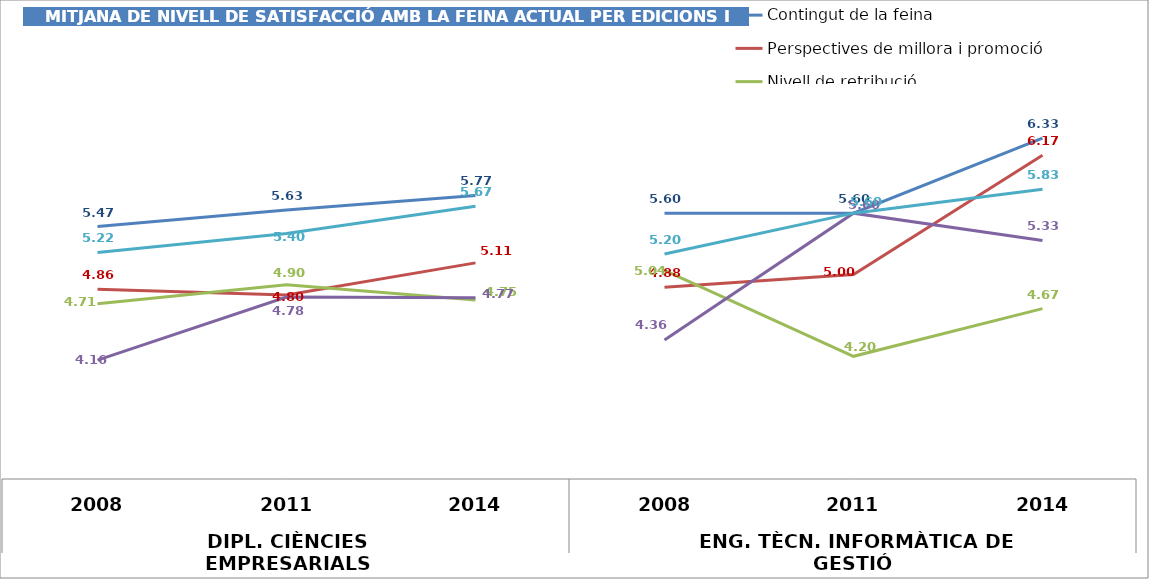
| Category | Contingut de la feina | Perspectives de millora i promoció | Nivell de retribució | Utilitat dels coneixements de la formació universitària | Satisfacció general amb la feina * |
|---|---|---|---|---|---|
| 0 | 5.469 | 4.856 | 4.714 | 4.163 | 5.216 |
| 1 | 5.63 | 4.8 | 4.9 | 4.78 | 5.4 |
| 2 | 5.773 | 5.114 | 4.75 | 4.773 | 5.667 |
| 3 | 5.6 | 4.875 | 5.04 | 4.36 | 5.2 |
| 4 | 5.6 | 5 | 4.2 | 5.6 | 5.6 |
| 5 | 6.333 | 6.167 | 4.667 | 5.333 | 5.833 |